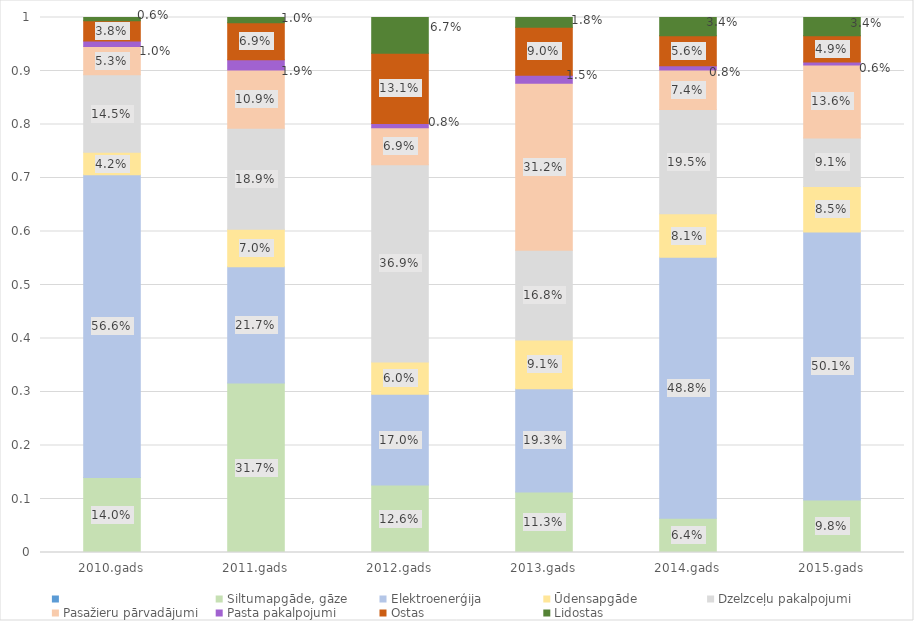
| Category | Series 0 | Siltumapgāde, gāze | Elektroenerģija | Ūdensapgāde | Dzelzceļu pakalpojumi | Pasažieru pārvadājumi | Pasta pakalpojumi | Ostas | Lidostas |
|---|---|---|---|---|---|---|---|---|---|
| 2010.gads |  | 0.14 | 0.566 | 0.042 | 0.145 | 0.053 | 0.01 | 0.038 | 0.006 |
| 2011.gads |  | 0.317 | 0.217 | 0.07 | 0.189 | 0.109 | 0.019 | 0.069 | 0.01 |
| 2012.gads |  | 0.126 | 0.17 | 0.06 | 0.369 | 0.069 | 0.008 | 0.131 | 0.067 |
| 2013.gads |  | 0.113 | 0.193 | 0.091 | 0.168 | 0.312 | 0.015 | 0.09 | 0.018 |
| 2014.gads |  | 0.064 | 0.488 | 0.081 | 0.195 | 0.074 | 0.008 | 0.056 | 0.034 |
| 2015.gads |  | 0.098 | 0.501 | 0.085 | 0.091 | 0.136 | 0.006 | 0.049 | 0.034 |